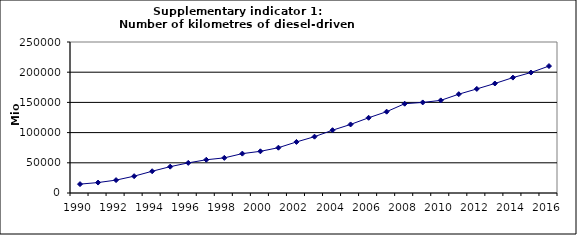
| Category | Number of kilometres of diesel-driven passenger cars, Mio km |
|---|---|
| 1990 | 14717.435 |
| 1991 | 17306.443 |
| 1992 | 21359.321 |
| 1993 | 27866.991 |
| 1994 | 36026.063 |
| 1995 | 43609.619 |
| 1996 | 49869.768 |
| 1997 | 55028.811 |
| 1998 | 58179.786 |
| 1999 | 65198.668 |
| 2000 | 68999.741 |
| 2001 | 75015.534 |
| 2002 | 84524.752 |
| 2003 | 93257.628 |
| 2004 | 103952.55 |
| 2005 | 113495.429 |
| 2006 | 124549.25 |
| 2007 | 134669.603 |
| 2008 | 147824.09 |
| 2009 | 149960.461 |
| 2010 | 153329.822 |
| 2011 | 163601.826 |
| 2012 | 172330.966 |
| 2013 | 181269.48 |
| 2014 | 191063.356 |
| 2015 | 199437.774 |
| 2016 | 210183.153 |